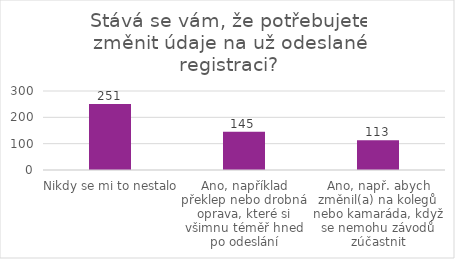
| Category | Series 0 |
|---|---|
| Nikdy se mi to nestalo | 251 |
| Ano, například překlep nebo drobná oprava, které si všimnu téměř hned po odeslání | 145 |
| Ano, např. abych změnil(a) na kolegů nebo kamaráda, když se nemohu závodů zúčastnit | 113 |